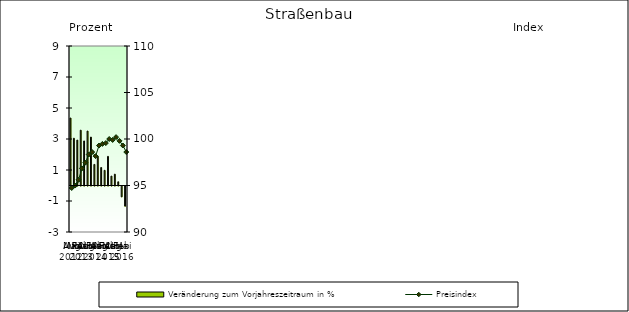
| Category | Veränderung zum Vorjahreszeitraum in % |
|---|---|
| 0 | 4.352 |
| 1 | 3.048 |
| 2 | 2.93 |
| 3 | 3.568 |
| 4 | 2.873 |
| 5 | 3.512 |
| 6 | 3.122 |
| 7 | 1.36 |
| 8 | 1.892 |
| 9 | 1.161 |
| 10 | 0.98 |
| 11 | 1.878 |
| 12 | 0.607 |
| 13 | 0.731 |
| 14 | 0.24 |
| 15 | -0.7 |
| 16 | -1.3 |